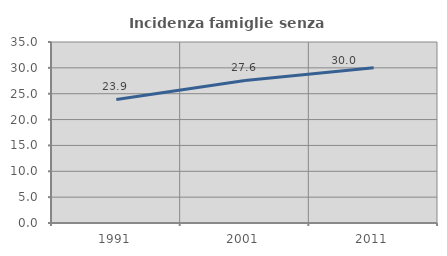
| Category | Incidenza famiglie senza nuclei |
|---|---|
| 1991.0 | 23.897 |
| 2001.0 | 27.575 |
| 2011.0 | 30 |